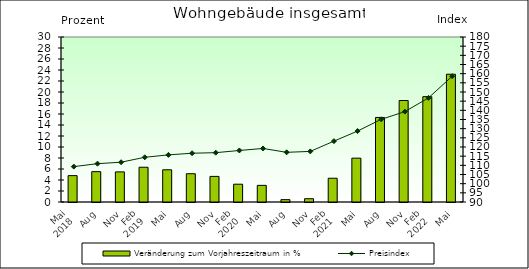
| Category | Veränderung zum Vorjahreszeitraum in % |
|---|---|
| 0 | 4.794 |
| 1 | 5.519 |
| 2 | 5.477 |
| 3 | 6.32 |
| 4 | 5.855 |
| 5 | 5.14 |
| 6 | 4.655 |
| 7 | 3.234 |
| 8 | 3.025 |
| 9 | 0.429 |
| 10 | 0.599 |
| 11 | 4.318 |
| 12 | 7.97 |
| 13 | 15.371 |
| 14 | 18.452 |
| 15 | 19.156 |
| 16 | 23.232 |